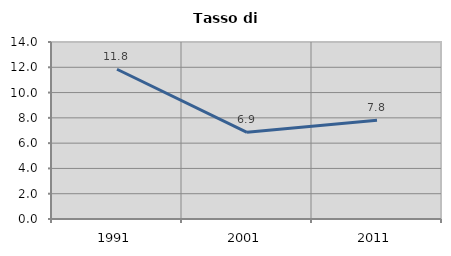
| Category | Tasso di disoccupazione   |
|---|---|
| 1991.0 | 11.846 |
| 2001.0 | 6.854 |
| 2011.0 | 7.812 |